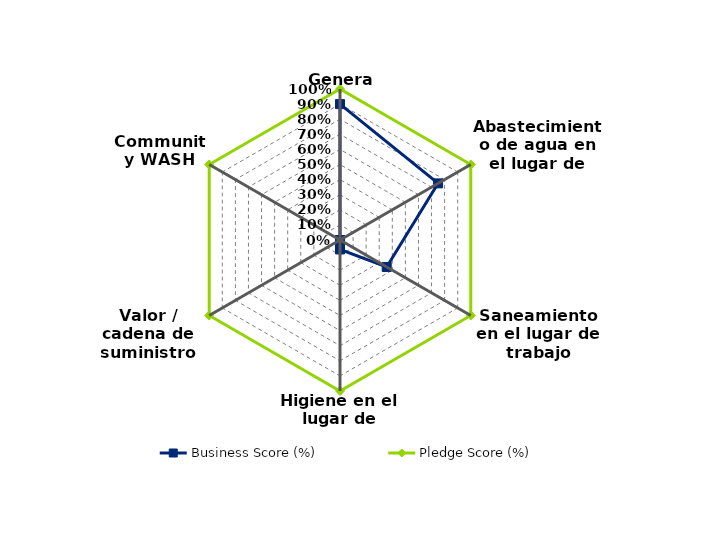
| Category | Business Score (%) | Pledge Score (%) |
|---|---|---|
| General | 0.9 | 1 |
| Abastecimiento de agua en el lugar de trabajo | 0.75 | 1 |
| Saneamiento en el lugar de trabajo | 0.357 | 1 |
| Higiene en el lugar de trabajo | 0.062 | 1 |
| Valor / cadena de suministro WASH | 0 | 1 |
| Community WASH | 0 | 1 |